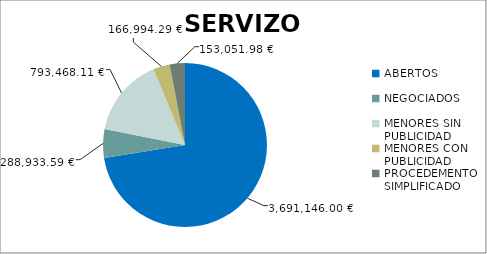
| Category | Series 0 |
|---|---|
| ABERTOS  | 3691146 |
| NEGOCIADOS  | 288933.59 |
| MENORES SIN PUBLICIDAD | 793468.11 |
| MENORES CON PUBLICIDAD | 166994.29 |
| PROCEDEMENTO SIMPLIFICADO | 153051.98 |